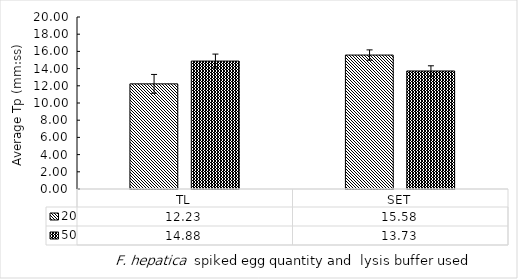
| Category | 20 | 50 |
|---|---|---|
| TL | 12.225 | 14.875 |
| SET | 15.575 | 13.725 |